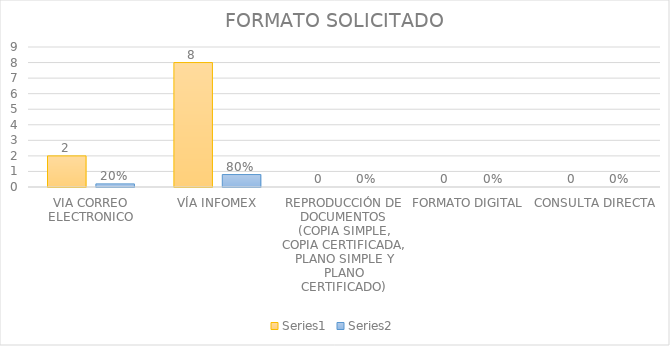
| Category | Series 3 | Series 4 |
|---|---|---|
| VIA CORREO ELECTRONICO | 2 | 0.2 |
| VÍA INFOMEX | 8 | 0.8 |
| REPRODUCCIÓN DE DOCUMENTOS (COPIA SIMPLE, COPIA CERTIFICADA, PLANO SIMPLE Y PLANO CERTIFICADO) | 0 | 0 |
| FORMATO DIGITAL | 0 | 0 |
| CONSULTA DIRECTA | 0 | 0 |